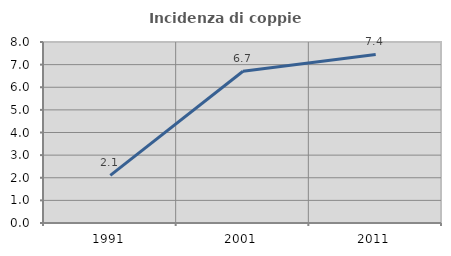
| Category | Incidenza di coppie miste |
|---|---|
| 1991.0 | 2.108 |
| 2001.0 | 6.709 |
| 2011.0 | 7.448 |